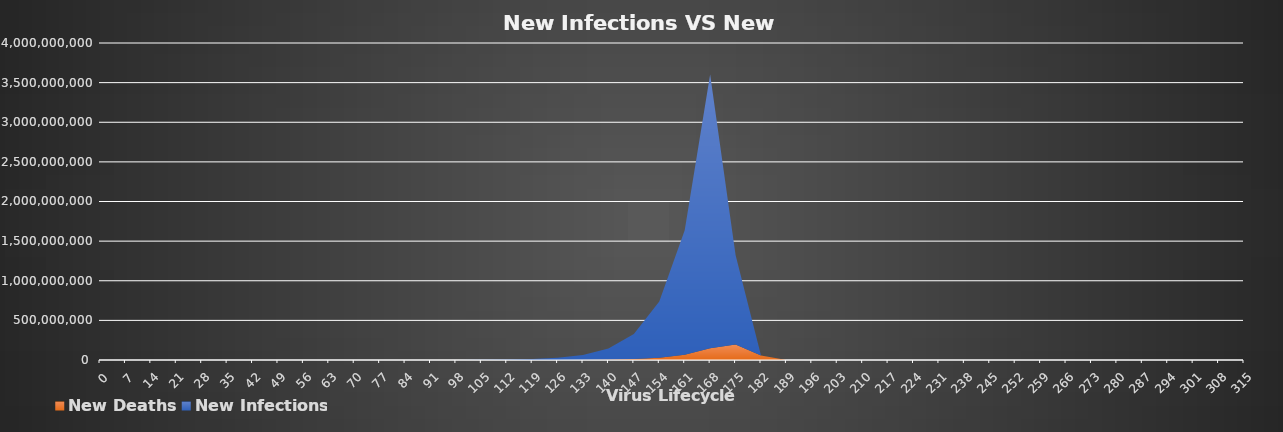
| Category | New Deaths | New Infections |
|---|---|---|
| 0.0 | 0.04 | 2 |
| 7.0 | 0.206 | 5.32 |
| 14.0 | 0.547 | 14.045 |
| 21.0 | 1.438 | 36.797 |
| 28.0 | 3.753 | 95.673 |
| 35.0 | 9.72 | 246.837 |
| 42.0 | 24.98 | 631.902 |
| 49.0 | 63.696 | 1605.032 |
| 56.0 | 161.145 | 4044.68 |
| 63.0 | 404.468 | 10111.699 |
| 70.0 | 1007.125 | 25077.014 |
| 77.0 | 2487.64 | 61689.454 |
| 84.0 | 6094.918 | 150522.267 |
| 91.0 | 14811.391 | 364263.886 |
| 98.0 | 35697.861 | 874233.326 |
| 105.0 | 85325.173 | 2080675.315 |
| 112.0 | 202241.641 | 4910393.744 |
| 119.0 | 475326.114 | 11490321.361 |
| 126.0 | 1107666.979 | 26657545.558 |
| 133.0 | 2559124.374 | 61312354.783 |
| 140.0 | 5861461.117 | 139792168.906 |
| 147.0 | 13308214.48 | 315930301.727 |
| 154.0 | 29950192.604 | 707683875.868 |
| 161.0 | 66805357.882 | 1571058204.428 |
| 168.0 | 147679471.216 | 3456328049.742 |
| 175.0 | 195430025.636 | 1130681157.461 |
| 182.0 | 56534057.873 | 0 |
| 189.0 | 0 | 0 |
| 196.0 | 0 | 0 |
| 203.0 | 0 | 0 |
| 210.0 | 0 | 0 |
| 217.0 | 0 | 0 |
| 224.0 | 0 | 0 |
| 231.0 | 0 | 0 |
| 238.0 | 0 | 0 |
| 245.0 | 0 | 0 |
| 252.0 | 0 | 0 |
| 259.0 | 0 | 0 |
| 266.0 | 0 | 0 |
| 273.0 | 0 | 0 |
| 280.0 | 0 | 0 |
| 287.0 | 0 | 0 |
| 294.0 | 0 | 0 |
| 301.0 | 0 | 0 |
| 308.0 | 0 | 0 |
| 315.0 | 0 | 0 |